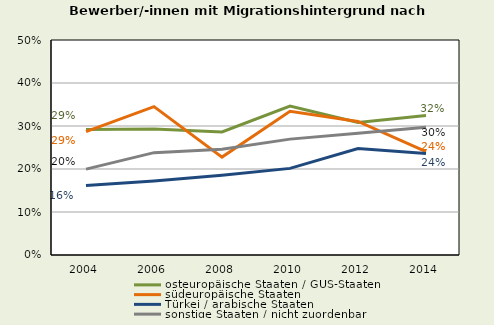
| Category | osteuropäische Staaten / GUS-Staaten | südeuropäische Staaten | Türkei / arabische Staaten | sonstige Staaten / nicht zuordenbar |
|---|---|---|---|---|
| 2004.0 | 0.292 | 0.287 | 0.162 | 0.2 |
| 2006.0 | 0.293 | 0.345 | 0.172 | 0.238 |
| 2008.0 | 0.286 | 0.228 | 0.185 | 0.246 |
| 2010.0 | 0.347 | 0.334 | 0.201 | 0.269 |
| 2012.0 | 0.308 | 0.31 | 0.248 | 0.283 |
| 2014.0 | 0.324 | 0.24 | 0.236 | 0.297 |